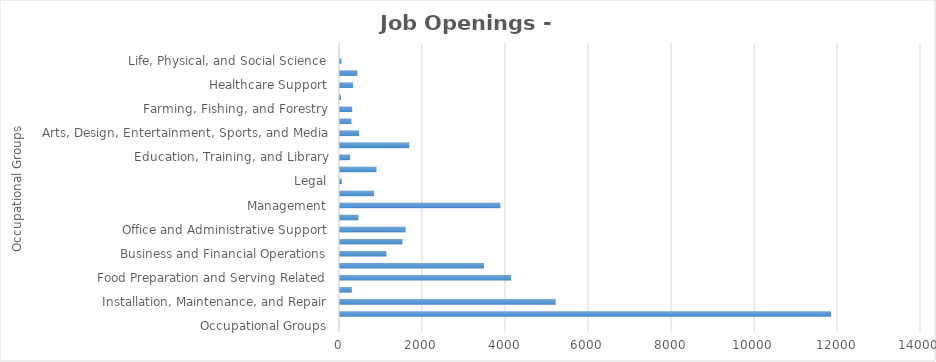
| Category | Series1 |
|---|---|
| Occupational Groups | 0 |
| Construction and Extraction | 11831 |
| Installation, Maintenance, and Repair | 5197 |
| Building and Grounds Cleaning and Maintenance | 286 |
| Food Preparation and Serving Related | 4124 |
| Personal Care and Service | 3467 |
| Business and Financial Operations | 1120 |
| Sales and Related | 1506 |
| Office and Administrative Support | 1581 |
| Architecture and Engineering | 443 |
| Management | 3864 |
| Transportation and Material Moving | 822 |
| Legal | 44 |
| Healthcare Practitioners and Technical | 880 |
| Education, Training, and Library | 244 |
| Production | 1670 |
| Arts, Design, Entertainment, Sports, and Media | 461 |
| Computer and Mathematical | 275 |
| Farming, Fishing, and Forestry | 295 |
| Community and Social Services | 26 |
| Healthcare Support | 316 |
| Protective Service | 418 |
| Life, Physical, and Social Science | 32 |
| Military Specific  | 0 |